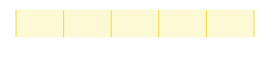
| Category | Rivaliteit onder huidige spelers |
|---|---|
| 0 | 0 |